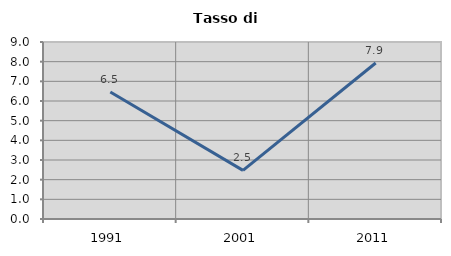
| Category | Tasso di disoccupazione   |
|---|---|
| 1991.0 | 6.462 |
| 2001.0 | 2.473 |
| 2011.0 | 7.933 |